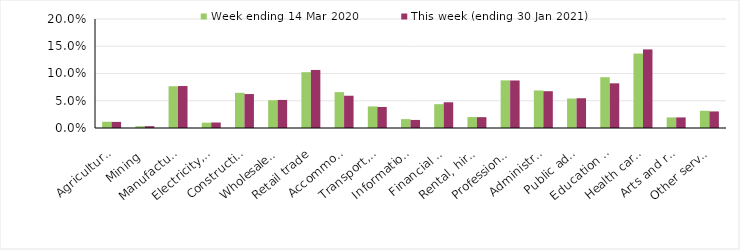
| Category | Week ending 14 Mar 2020 | This week (ending 30 Jan 2021) |
|---|---|---|
| Agriculture, forestry and fishing | 0.012 | 0.011 |
| Mining | 0.003 | 0.003 |
| Manufacturing | 0.077 | 0.077 |
| Electricity, gas, water and waste services | 0.01 | 0.01 |
| Construction | 0.065 | 0.062 |
| Wholesale trade | 0.051 | 0.052 |
| Retail trade | 0.102 | 0.106 |
| Accommodation and food services | 0.066 | 0.059 |
| Transport, postal and warehousing | 0.04 | 0.039 |
| Information media and telecommunications | 0.016 | 0.015 |
| Financial and insurance services | 0.044 | 0.047 |
| Rental, hiring and real estate services | 0.02 | 0.02 |
| Professional, scientific and technical services | 0.087 | 0.087 |
| Administrative and support services | 0.069 | 0.068 |
| Public administration and safety | 0.054 | 0.055 |
| Education and training | 0.093 | 0.082 |
| Health care and social assistance | 0.137 | 0.144 |
| Arts and recreation services | 0.019 | 0.019 |
| Other services | 0.032 | 0.03 |